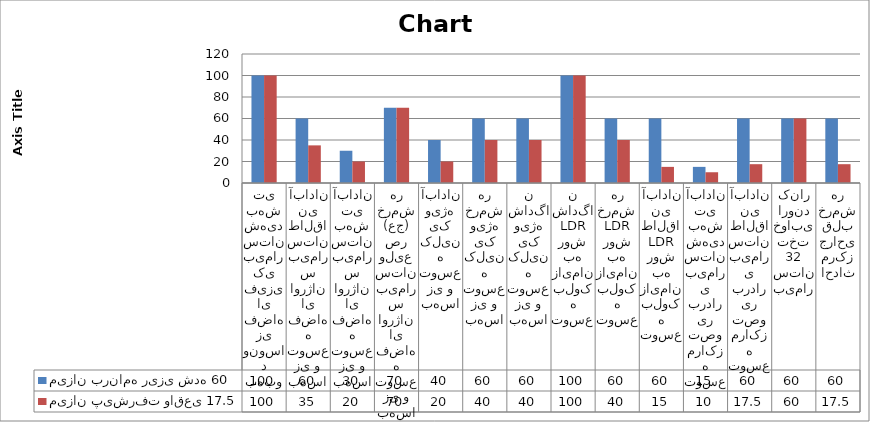
| Category | میزان برنامه ریزی شده 60 | میزان پیشرفت واقعی 17.5 |
|---|---|---|
| بهبود ونوسازی فضاهای فیزیکی بیمارستان شهید بهشتی | 100 | 100 |
| بهسازی و توسعه فضاهای اورژانس بیمارستان طالقانی آبادان | 60 | 35 |
| بهسازی و توسعه فضاهای اورژانس بیمارستان بهشتی آبادان | 30 | 20 |
| بهسازی و توسعه فضاهای اورژانس بیمارستان ولیعصر (عج) خرمشهر | 70 | 70 |
| بهسازی و توسعه کلینیک ویژه آبادان | 40 | 20 |
| بهسازی و توسعه کلینیک ویژه خرمشهر | 60 | 40 |
| بهسازی و توسعه کلینیک ویژه شادگان | 60 | 40 |
| توسعه بلوک زایمان به روش LDR شادگان | 100 | 100 |
| توسعه بلوک زایمان به روش LDR خرمشهر | 60 | 40 |
| توسعه بلوک زایمان به روش LDR طالقانی آبادان | 60 | 15 |
| توسعه مراکز تصویر برداری بیمارستان شهید بهشتی آبادان | 15 | 10 |
| توسعه مراکز تصویر برداری بیمارستان طالقانی آبادان | 60 | 17.5 |
| بیمارستان 32 تخت خوابی اروند کنار | 60 | 60 |
| احداث مرکز جراحی قلب خرمشهر | 60 | 17.5 |